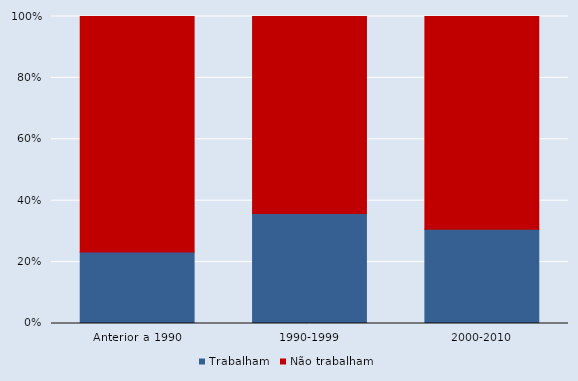
| Category | Trabalham | Não trabalham |
|---|---|---|
| Anterior a 1990 | 30.3 | 100 |
| 1990-1999 | 55.9 | 100 |
| 2000-2010 | 44.3 | 100 |